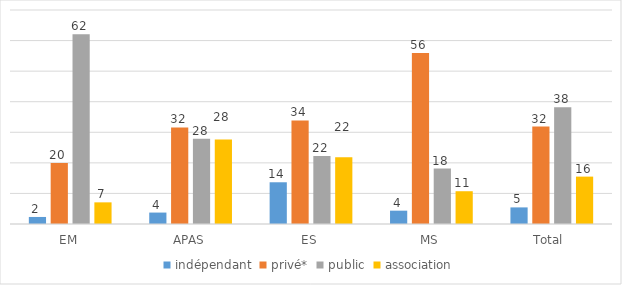
| Category | indépendant | privé* | public | association |
|---|---|---|---|---|
| EM | 2.3 | 19.96 | 62.1 | 7.08 |
| APAS | 3.74 | 31.57 | 27.88 | 27.68 |
| ES | 13.65 | 33.86 | 22.22 | 21.82 |
| MS | 4.36 | 55.97 | 18.15 | 10.72 |
| Total  | 5.43 | 31.88 | 38.21 | 15.5 |